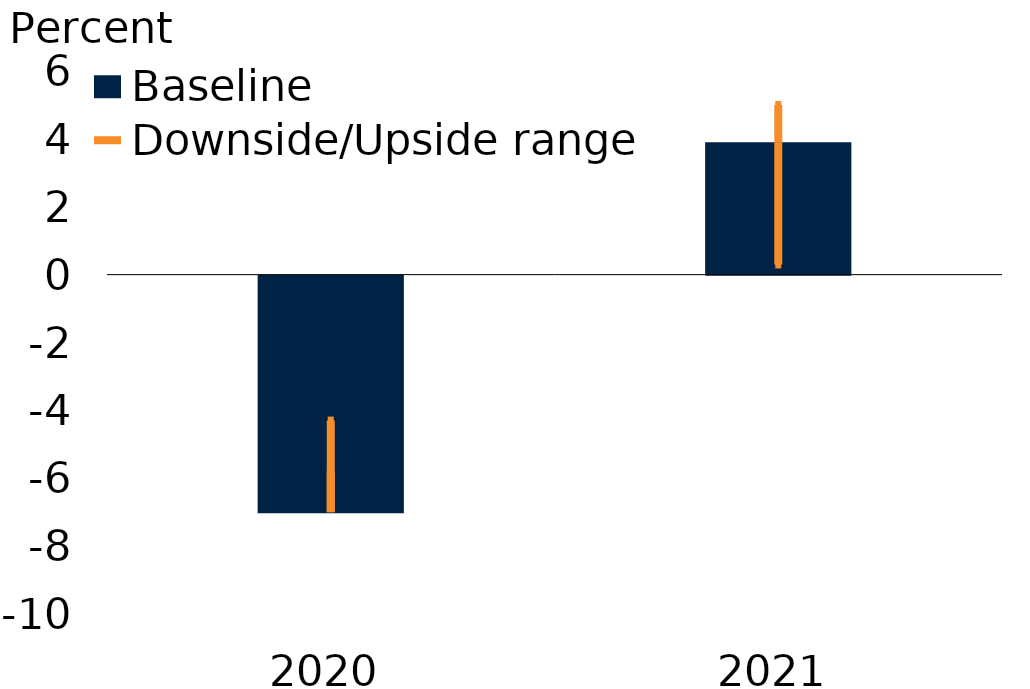
| Category | Baseline |
|---|---|
| 2020.0 | -7 |
| 2021.0 | 3.9 |